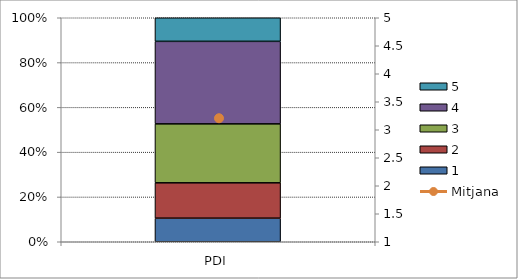
| Category | 1 | 2 | 3 | 4 | 5 |
|---|---|---|---|---|---|
| PDI | 2 | 3 | 5 | 7 | 2 |